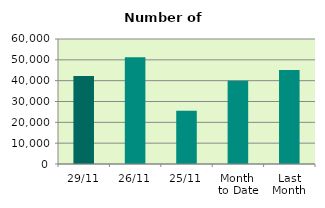
| Category | Series 0 |
|---|---|
| 29/11 | 42232 |
| 26/11 | 51206 |
| 25/11 | 25554 |
| Month 
to Date | 39965.619 |
| Last
Month | 45060.857 |